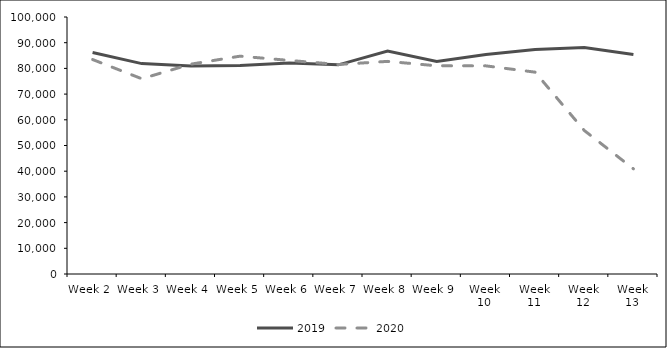
| Category | 2019 | 2020 |
|---|---|---|
| 0 | 86162 | 83456 |
| 1 | 81868 | 75976 |
| 2 | 80905 | 81657 |
| 3 | 81152 | 84761 |
| 4 | 82096 | 83104 |
| 5 | 81387 | 81521 |
| 6 | 86793 | 82732 |
| 7 | 82714 | 81011 |
| 8 | 85379 | 80984 |
| 9 | 87398 | 78538 |
| 10 | 88126 | 55853 |
| 11 | 85395 | 40929 |